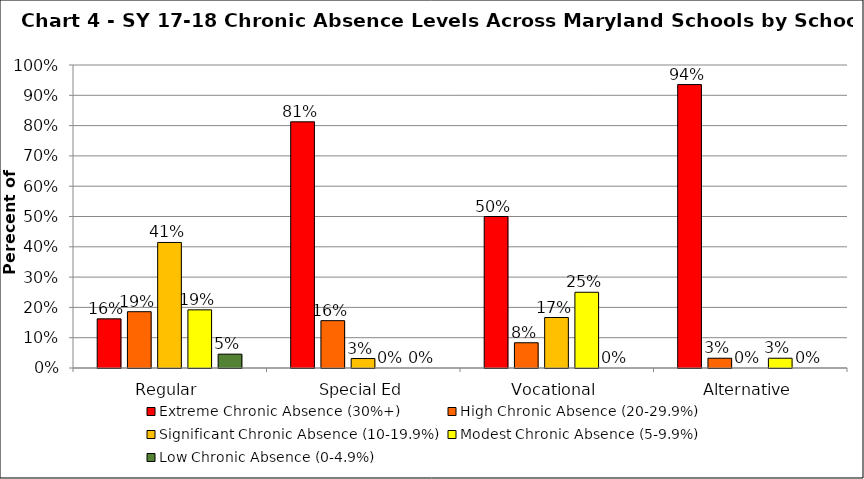
| Category | Extreme Chronic Absence (30%+) | High Chronic Absence (20-29.9%) | Significant Chronic Absence (10-19.9%) | Modest Chronic Absence (5-9.9%) | Low Chronic Absence (0-4.9%) |
|---|---|---|---|---|---|
| 0 | 0.162 | 0.186 | 0.414 | 0.192 | 0.046 |
| 1 | 0.812 | 0.156 | 0.031 | 0 | 0 |
| 2 | 0.5 | 0.083 | 0.167 | 0.25 | 0 |
| 3 | 0.935 | 0.032 | 0 | 0.032 | 0 |